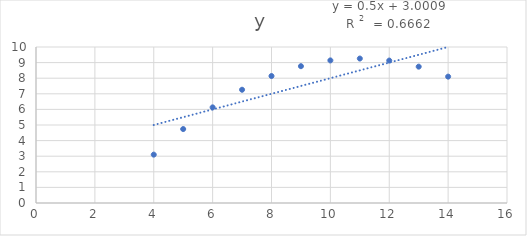
| Category | y |
|---|---|
| 10.0 | 9.14 |
| 8.0 | 8.14 |
| 13.0 | 8.74 |
| 9.0 | 8.77 |
| 11.0 | 9.26 |
| 14.0 | 8.1 |
| 6.0 | 6.13 |
| 4.0 | 3.1 |
| 12.0 | 9.13 |
| 7.0 | 7.26 |
| 5.0 | 4.74 |